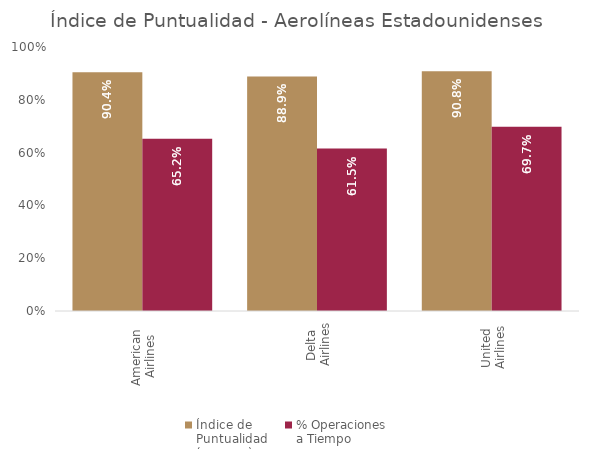
| Category | Índice de 
Puntualidad
(ene-sep) | % Operaciones 
a Tiempo |
|---|---|---|
| American 
Airlines | 0.904 | 0.652 |
| Delta 
Airlines | 0.889 | 0.615 |
| United 
Airlines | 0.908 | 0.697 |